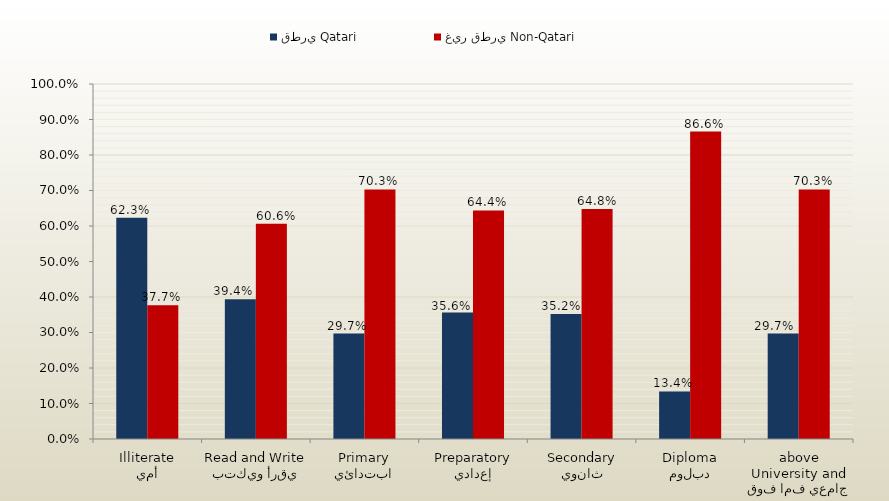
| Category | قطري Qatari | غير قطري Non-Qatari |
|---|---|---|
| أمي
Illiterate | 0.623 | 0.377 |
| يقرأ ويكتب
Read and Write | 0.394 | 0.606 |
| ابتدائي
Primary | 0.297 | 0.703 |
| إعدادي
Preparatory | 0.356 | 0.644 |
| ثانوي
Secondary | 0.352 | 0.648 |
| دبلوم
Diploma | 0.134 | 0.866 |
| جامعي فما فوق
University and above | 0.297 | 0.703 |